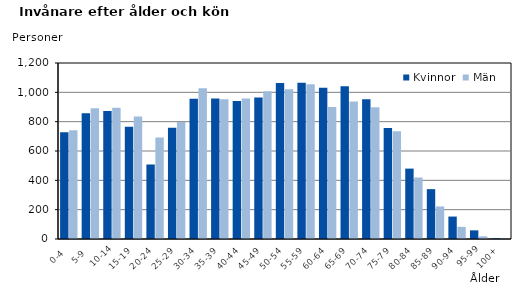
| Category | Kvinnor | Män |
|---|---|---|
|   0-4  | 728 | 741 |
|   5-9  | 858 | 891 |
| 10-14 | 872 | 895 |
| 15-19  | 766 | 835 |
| 20-24  | 508 | 692 |
| 25-29  | 758 | 798 |
| 30-34  | 956 | 1028 |
| 35-39  | 958 | 953 |
| 40-44  | 941 | 958 |
| 45-49  | 964 | 1008 |
| 50-54  | 1063 | 1021 |
| 55-59  | 1065 | 1055 |
| 60-64  | 1032 | 900 |
| 65-69  | 1041 | 937 |
| 70-74  | 952 | 898 |
| 75-79  | 757 | 735 |
| 80-84  | 480 | 419 |
| 85-89  | 340 | 222 |
| 90-94  | 153 | 83 |
| 95-99 | 59 | 18 |
| 100+ | 5 | 1 |